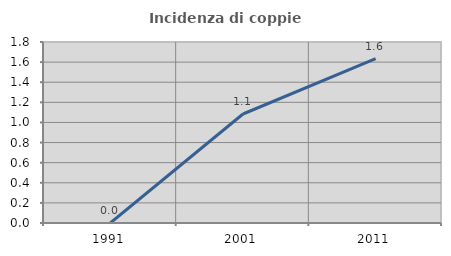
| Category | Incidenza di coppie miste |
|---|---|
| 1991.0 | 0 |
| 2001.0 | 1.084 |
| 2011.0 | 1.635 |